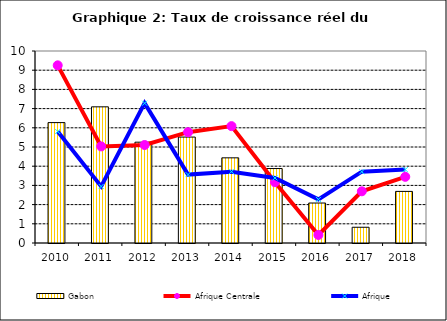
| Category | Gabon |
|---|---|
| 2010.0 | 6.27 |
| 2011.0 | 7.092 |
| 2012.0 | 5.251 |
| 2013.0 | 5.517 |
| 2014.0 | 4.435 |
| 2015.0 | 3.879 |
| 2016.0 | 2.082 |
| 2017.0 | 0.82 |
| 2018.0 | 2.687 |